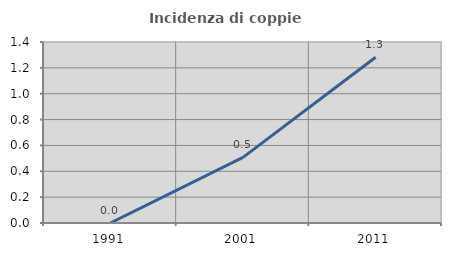
| Category | Incidenza di coppie miste |
|---|---|
| 1991.0 | 0 |
| 2001.0 | 0.508 |
| 2011.0 | 1.282 |